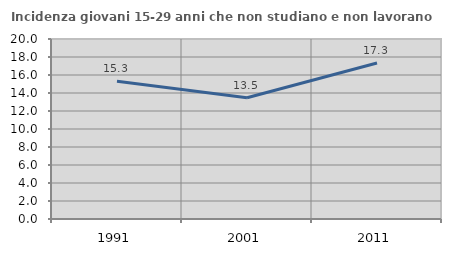
| Category | Incidenza giovani 15-29 anni che non studiano e non lavorano  |
|---|---|
| 1991.0 | 15.293 |
| 2001.0 | 13.47 |
| 2011.0 | 17.333 |